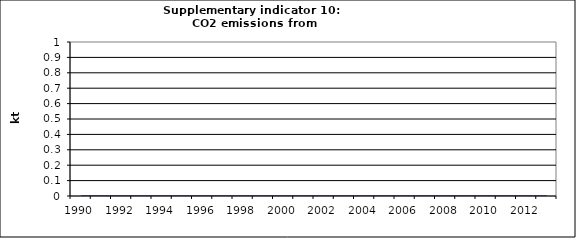
| Category | CO2 emissions from autoproducers, kt |
|---|---|
| 1990 | 0 |
| 1991 | 0 |
| 1992 | 0 |
| 1993 | 0 |
| 1994 | 0 |
| 1995 | 0 |
| 1996 | 0 |
| 1997 | 0 |
| 1998 | 0 |
| 1999 | 0 |
| 2000 | 0 |
| 2001 | 0 |
| 2002 | 0 |
| 2003 | 0 |
| 2004 | 0 |
| 2005 | 0 |
| 2006 | 0 |
| 2007 | 0 |
| 2008 | 0 |
| 2009 | 0 |
| 2010 | 0 |
| 2011 | 0 |
| 2012 | 0 |
| 2013 | 0 |